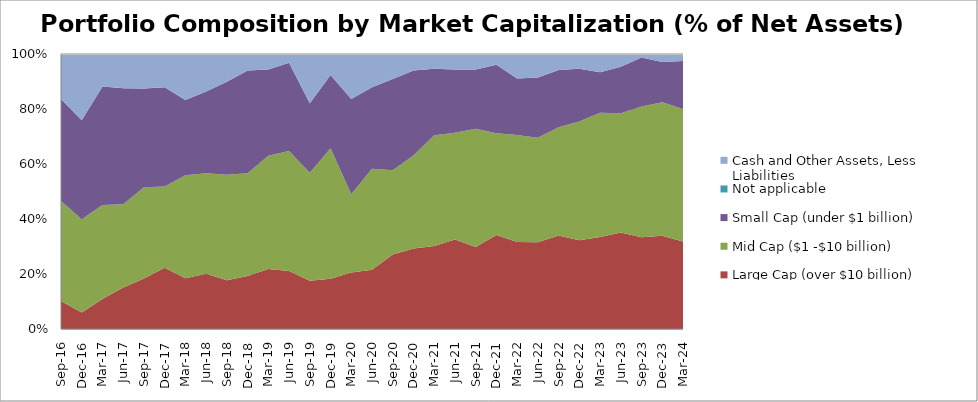
| Category | Large Cap (over $10 billion) | Mid Cap ($1 -$10 billion) | Small Cap (under $1 billion) | Not applicable | Cash and Other Assets, Less Liabilities |
|---|---|---|---|---|---|
| 2016-09-30 | 10.14 | 36.45 | 37.07 | 0 | 16.34 |
| 2016-12-31 | 6 | 33.889 | 36.021 | 0 | 24.09 |
| 2017-03-31 | 10.92 | 34.18 | 43.1 | 0 | 11.79 |
| 2017-06-30 | 15.074 | 30.287 | 42.204 | 0 | 12.434 |
| 2017-09-30 | 18.35 | 33.22 | 35.92 | 0 | 12.51 |
| 2017-12-31 | 22.29 | 29.51 | 36.07 | 0 | 12.13 |
| 2018-03-31 | 18.47 | 37.43 | 27.35 | 0 | 16.75 |
| 2018-06-30 | 20.12 | 36.5 | 29.784 | 0 | 13.6 |
| 2018-09-30 | 17.72 | 38.4 | 33.8 | 0 | 10.08 |
| 2018-12-31 | 19.23 | 37.42 | 37.31 | 0 | 6.04 |
| 2019-03-31 | 21.79 | 41.24 | 31.37 | 0 | 5.6 |
| 2019-06-30 | 21.12 | 43.57 | 32.13 | 0 | 3.18 |
| 2019-09-30 | 17.59 | 39.19 | 25.35 | 0 | 17.87 |
| 2019-12-31 | 18.29 | 47.45 | 26.58 | 0 | 7.68 |
| 2020-03-31 | 20.58 | 28.39 | 34.71 | 0 | 16.32 |
| 2020-06-30 | 21.53 | 36.7 | 29.68 | 0 | 12.09 |
| 2020-09-30 | 27.11 | 30.6 | 33.24 | 0 | 9.05 |
| 2020-12-31 | 29.23 | 33.9 | 30.83 | 0 | 6.04 |
| 2021-03-31 | 30.2 | 40.22 | 24.21 | 0 | 5.37 |
| 2021-06-30 | 32.52 | 38.86 | 22.95 | 0 | 5.67 |
| 2021-09-30 | 29.86 | 42.93 | 21.53 | 0 | 5.68 |
| 2021-12-31 | 34.2 | 36.98 | 24.95 | 0 | 3.87 |
| 2022-03-31 | 31.6 | 38.97 | 20.51 | 0 | 8.92 |
| 2022-06-30 | 31.54 | 38 | 21.9 | 0 | 8.56 |
| 2022-09-30 | 33.98 | 39.41 | 20.8 | 0 | 5.81 |
| 2022-12-31 | 32.27 | 43.14 | 19.24 | 0 | 5.35 |
| 2023-03-31 | 33.45 | 45.19 | 14.71 | 0 | 6.65 |
| 2023-06-30 | 35.05 | 43.36 | 16.94 | 0 | 4.65 |
| 2023-09-30 | 33.35 | 47.54 | 17.87 | 0 | 1.24 |
| 2023-12-31 | 33.89 | 48.53 | 14.66 | 0 | 2.92 |
| 2024-03-31 | 31.84 | 48.14 | 17.47 | 0 | 2.55 |